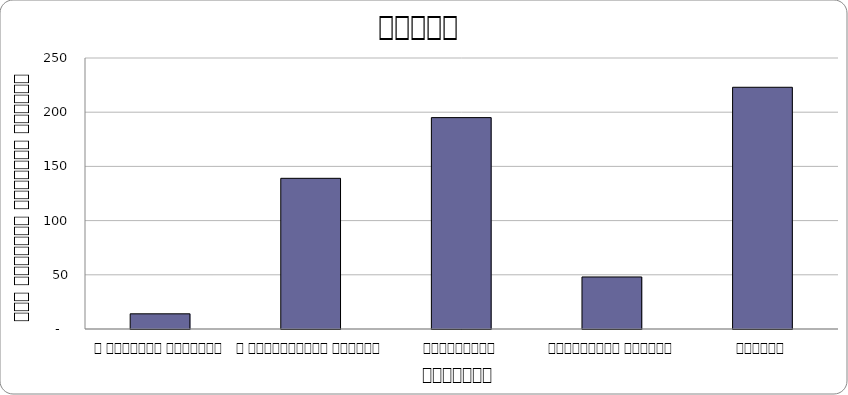
| Category | Series 0 |
|---|---|
| द हिमालयन टाइम्स् | 14 |
| द काठमाण्डौं पोस्ट् | 139 |
| कान्तिपुर | 195 |
| अन्नपूर्ण पोस्ट् | 48 |
| नागरिक | 223 |